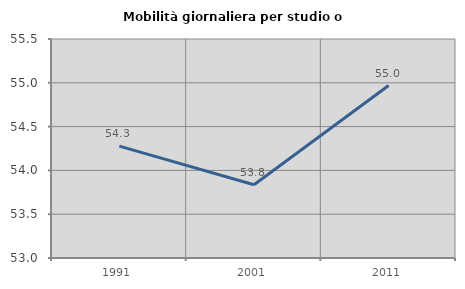
| Category | Mobilità giornaliera per studio o lavoro |
|---|---|
| 1991.0 | 54.278 |
| 2001.0 | 53.837 |
| 2011.0 | 54.969 |